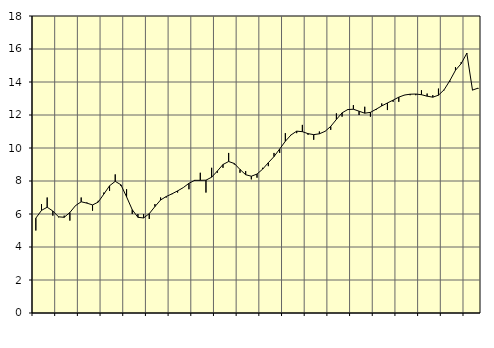
| Category | Piggar | Series 1 |
|---|---|---|
| nan | 5 | 5.75 |
| 1.0 | 6.6 | 6.22 |
| 1.0 | 7 | 6.41 |
| 1.0 | 5.9 | 6.18 |
| nan | 5.8 | 5.83 |
| 2.0 | 5.9 | 5.8 |
| 2.0 | 5.6 | 6.09 |
| 2.0 | 6.5 | 6.51 |
| nan | 7 | 6.74 |
| 3.0 | 6.7 | 6.66 |
| 3.0 | 6.2 | 6.55 |
| 3.0 | 6.8 | 6.72 |
| nan | 7.3 | 7.21 |
| 4.0 | 7.4 | 7.71 |
| 4.0 | 8.4 | 7.98 |
| 4.0 | 7.7 | 7.77 |
| nan | 7.5 | 7.04 |
| 5.0 | 6 | 6.26 |
| 5.0 | 6 | 5.8 |
| 5.0 | 6 | 5.76 |
| nan | 5.7 | 6.02 |
| 6.0 | 6.6 | 6.45 |
| 6.0 | 7 | 6.85 |
| 6.0 | 7 | 7.06 |
| nan | 7.2 | 7.22 |
| 7.0 | 7.3 | 7.4 |
| 7.0 | 7.6 | 7.6 |
| 7.0 | 7.5 | 7.86 |
| nan | 8 | 8.04 |
| 8.0 | 8.5 | 8.04 |
| 8.0 | 7.3 | 8.05 |
| 8.0 | 8.8 | 8.23 |
| nan | 8.5 | 8.6 |
| 9.0 | 8.8 | 9 |
| 9.0 | 9.7 | 9.18 |
| 9.0 | 9 | 9.06 |
| nan | 8.5 | 8.7 |
| 10.0 | 8.6 | 8.38 |
| 10.0 | 8.1 | 8.29 |
| 10.0 | 8.2 | 8.42 |
| nan | 8.8 | 8.72 |
| 11.0 | 8.9 | 9.11 |
| 11.0 | 9.7 | 9.48 |
| 11.0 | 9.7 | 9.94 |
| nan | 10.9 | 10.41 |
| 12.0 | 10.8 | 10.79 |
| 12.0 | 10.9 | 11.02 |
| 12.0 | 11.4 | 10.99 |
| nan | 10.8 | 10.87 |
| 13.0 | 10.5 | 10.81 |
| 13.0 | 11 | 10.86 |
| 13.0 | 11 | 11.01 |
| nan | 11.1 | 11.31 |
| 14.0 | 12.1 | 11.73 |
| 14.0 | 11.9 | 12.13 |
| 14.0 | 12.3 | 12.33 |
| nan | 12.6 | 12.35 |
| 15.0 | 12 | 12.23 |
| 15.0 | 12.5 | 12.11 |
| 15.0 | 11.9 | 12.16 |
| nan | 12.3 | 12.35 |
| 16.0 | 12.7 | 12.55 |
| 16.0 | 12.3 | 12.73 |
| 16.0 | 12.8 | 12.9 |
| nan | 12.8 | 13.08 |
| 17.0 | 13.2 | 13.21 |
| 17.0 | 13.2 | 13.26 |
| 17.0 | 13.2 | 13.27 |
| nan | 13.5 | 13.23 |
| 18.0 | 13.3 | 13.14 |
| 18.0 | 13.2 | 13.08 |
| 18.0 | 13.6 | 13.2 |
| nan | 13.5 | 13.53 |
| 19.0 | 14 | 14.08 |
| 19.0 | 14.9 | 14.71 |
| 19.0 | 15.2 | 15.11 |
| nan | 15.7 | 15.74 |
| 20.0 | 13.5 | 13.51 |
| 20.0 | 13.6 | 13.63 |